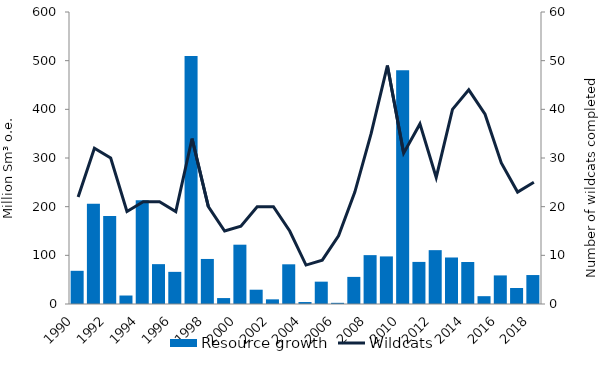
| Category | Resource growth |
|---|---|
| 1990.0 | 68.193 |
| 1991.0 | 205.969 |
| 1992.0 | 180.934 |
| 1993.0 | 17.433 |
| 1994.0 | 213.078 |
| 1995.0 | 81.89 |
| 1996.0 | 66.046 |
| 1997.0 | 509.387 |
| 1998.0 | 92.552 |
| 1999.0 | 12.186 |
| 2000.0 | 121.873 |
| 2001.0 | 29.368 |
| 2002.0 | 9.572 |
| 2003.0 | 81.565 |
| 2004.0 | 4.041 |
| 2005.0 | 45.912 |
| 2006.0 | 2.416 |
| 2007.0 | 55.693 |
| 2008.0 | 100.417 |
| 2009.0 | 97.783 |
| 2010.0 | 480.123 |
| 2011.0 | 86.492 |
| 2012.0 | 110.639 |
| 2013.0 | 95.56 |
| 2014.0 | 86.291 |
| 2015.0 | 16.076 |
| 2016.0 | 58.751 |
| 2017.0 | 32.836 |
| 2018.0 | 59.5 |